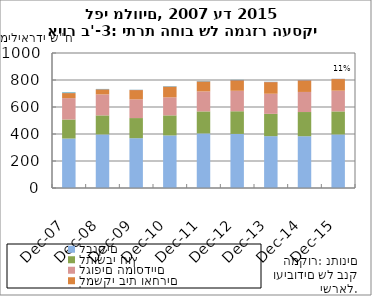
| Category | לבנקים | לתושבי חוץ | לגופים המוסדיים | למשקי בית ואחרים | לחברות כרטיסי אשראי | לממשלה (מוכוון) |
|---|---|---|---|---|---|---|
| 2007-12-31 | 366.393 | 141.02 | 158.215 | 37.252 | 0.559 | 4.522 |
| 2008-12-31 | 396.881 | 140.977 | 155.602 | 37.278 | 0.907 | 2.141 |
| 2009-12-31 | 369.016 | 149.032 | 138.644 | 68.615 | 1.092 | 1.159 |
| 2010-12-31 | 389.483 | 148.5 | 133.688 | 78.694 | 1.035 | 2.448 |
| 2011-12-31 | 404.383 | 163.001 | 148.093 | 73.27 | 1.307 | 1.832 |
| 2012-12-31 | 400.63 | 167.83 | 151.639 | 77.591 | 1.504 | 1.675 |
| 2013-12-31 | 384.001 | 165.243 | 149.002 | 85.925 | 1.564 | 0.944 |
| 2014-12-31 | 383.47 | 179.272 | 148.769 | 84.831 | 1.541 | 0.414 |
| 2015-12-31 | 396.718 | 170.678 | 153.537 | 85.944 | 1.482 | 0.378 |